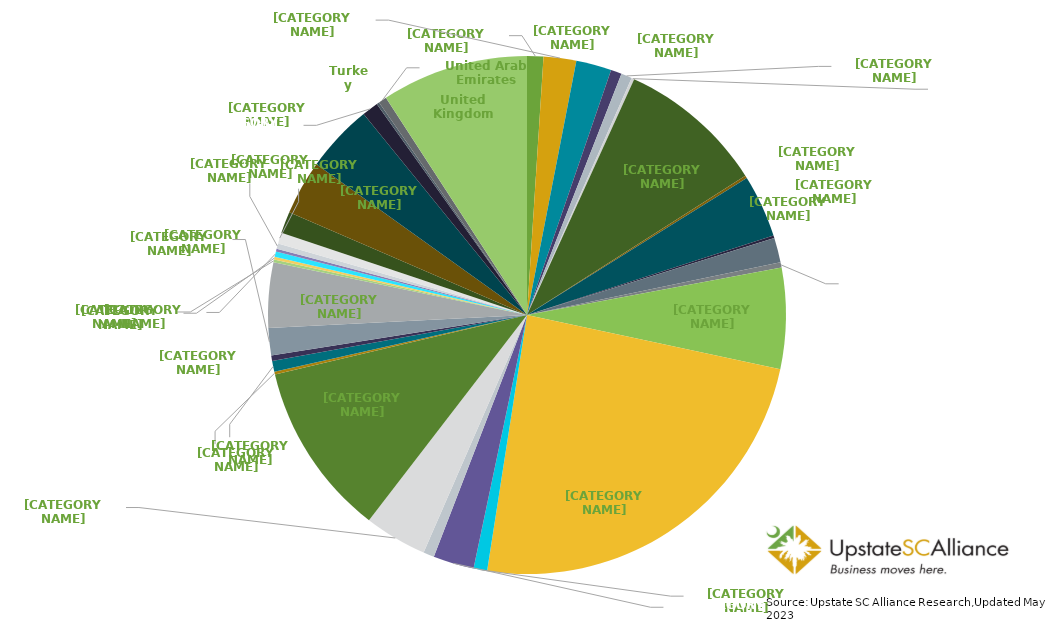
| Category | Percentage |
|---|---|
| Australia | 0.01 |
| Austria | 0.02 |
| Belgium | 0.022 |
| Bermuda | 0.007 |
| Brazil | 0.007 |
| British Virgin Islands | 0.002 |
| Canada | 0.092 |
| Cayman Islands | 0.002 |
| China | 0.039 |
| Czech Republic | 0.002 |
| Denmark | 0.015 |
| Finland | 0.003 |
| France | 0.063 |
| Germany | 0.241 |
| India | 0.008 |
| Ireland | 0.025 |
| Israel | 0.007 |
| Italy | 0.039 |
| Japan | 0.109 |
| Lithuania | 0.002 |
| Luxembourg | 0.007 |
| Mauritius | 0.003 |
| Mexico | 0.017 |
| Netherlands | 0.041 |
| Poland | 0.002 |
| Portugal | 0.002 |
| Singapore | 0.003 |
| Slovenia | 0.002 |
| South Africa | 0.003 |
| South Korea | 0.007 |
| Spain | 0.014 |
| Sweden | 0.034 |
| Switzerland | 0.042 |
| Taiwan | 0.01 |
| Turkey | 0.002 |
| United Arab Emirates | 0.005 |
| United Kingdom | 0.092 |